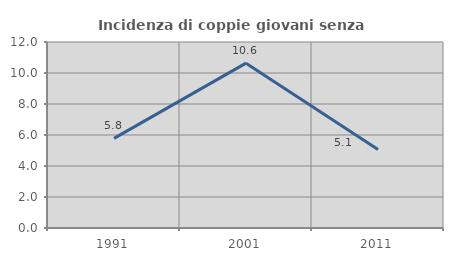
| Category | Incidenza di coppie giovani senza figli |
|---|---|
| 1991.0 | 5.78 |
| 2001.0 | 10.634 |
| 2011.0 | 5.068 |